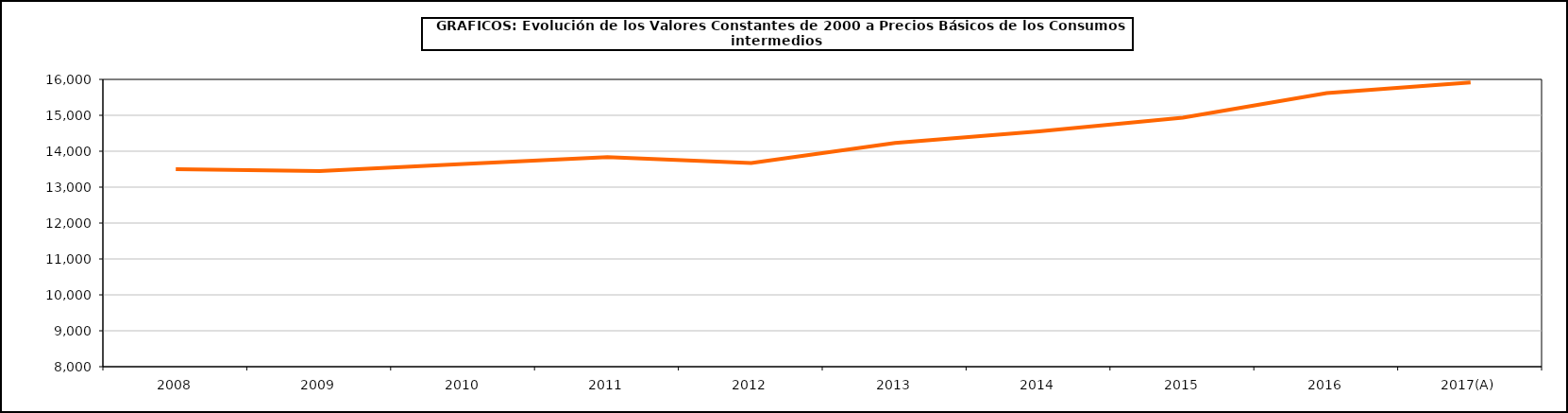
| Category | Total consumos intermedios |
|---|---|
| 2008 | 13501.9 |
| 2009 | 13446.9 |
| 2010 | 13642 |
| 2011 | 13835.8 |
| 2012 | 13669.3 |
| 2013 | 14227.7 |
| 2014 | 14550.6 |
| 2015 | 14933.8 |
| 2016 | 15620.2 |
| 2017(A) | 15915.1 |